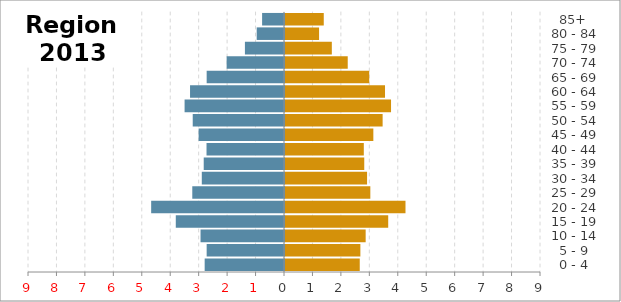
| Category | Female | Male |
|---|---|---|
|   0 - 4 | 2.628 | -2.789 |
|   5 - 9 | 2.65 | -2.719 |
| 10 - 14 | 2.836 | -2.934 |
| 15 - 19 | 3.629 | -3.804 |
| 20 - 24 | 4.236 | -4.67 |
| 25 - 29 | 3 | -3.224 |
| 30 - 34 | 2.886 | -2.89 |
| 35 - 39 | 2.786 | -2.822 |
| 40 - 44 | 2.77 | -2.724 |
| 45 - 49 | 3.106 | -3.002 |
| 50 - 54 | 3.432 | -3.209 |
| 55 - 59 | 3.728 | -3.495 |
| 60 - 64 | 3.516 | -3.303 |
| 65 - 69 | 2.961 | -2.719 |
| 70 - 74 | 2.205 | -2.017 |
| 75 - 79 | 1.646 | -1.374 |
| 80 - 84 | 1.198 | -0.96 |
|   85+ | 1.363 | -0.77 |